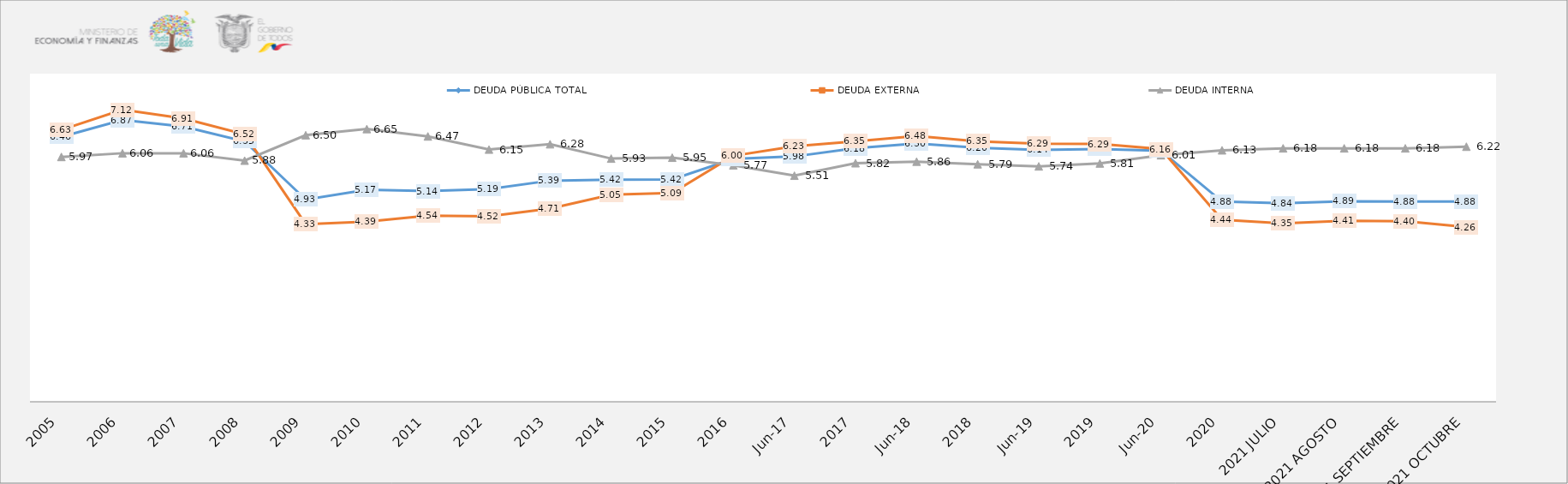
| Category | DEUDA PÚBLICA TOTAL | DEUDA EXTERNA  | DEUDA INTERNA |
|---|---|---|---|
| 2005 | 6.46 | 6.63 | 5.97 |
| 2006 | 6.87 | 7.12 | 6.06 |
| 2007 | 6.71 | 6.91 | 6.06 |
| 2008 | 6.35 | 6.52 | 5.88 |
| 2009 | 4.93 | 4.33 | 6.5 |
| 2010 | 5.17 | 4.39 | 6.65 |
| 2011 | 5.137 | 4.54 | 6.47 |
| 2012 | 5.186 | 4.521 | 6.15 |
| 2013 | 5.391 | 4.709 | 6.28 |
| 2014 | 5.416 | 5.048 | 5.93 |
| 2015 | 5.421 | 5.092 | 5.952 |
| 2016 | 5.922 | 5.998 | 5.767 |
| jun-17 | 5.982 | 6.228 | 5.513 |
| 2017 | 6.181 | 6.35 | 5.817 |
| jun-18 | 6.297 | 6.479 | 5.855 |
| 2018 | 6.195 | 6.35 | 5.792 |
| jun-19 | 6.143 | 6.29 | 5.74 |
| 2019 | 6.164 | 6.285 | 5.811 |
| jun-20 | 6.121 | 6.161 | 6.012 |
| 2020 | 4.881 | 4.437 | 6.132 |
| 2021 JULIO | 4.84 | 4.351 | 6.18 |
| 2021 AGOSTO | 4.89 | 4.41 | 6.18 |
| 2021 SEPTIEMBRE | 4.88 | 4.4 | 6.18 |
| 2021 OCTUBRE | 4.88 | 4.26 | 6.22 |